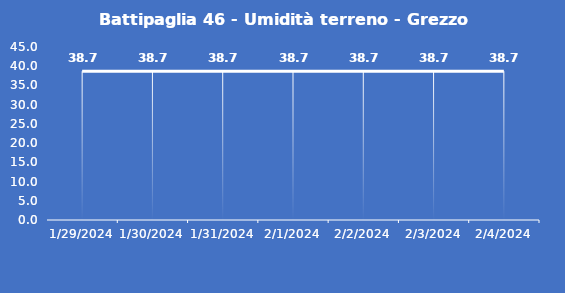
| Category | Battipaglia 46 - Umidità terreno - Grezzo (%VWC) |
|---|---|
| 1/29/24 | 38.7 |
| 1/30/24 | 38.7 |
| 1/31/24 | 38.7 |
| 2/1/24 | 38.7 |
| 2/2/24 | 38.7 |
| 2/3/24 | 38.7 |
| 2/4/24 | 38.7 |